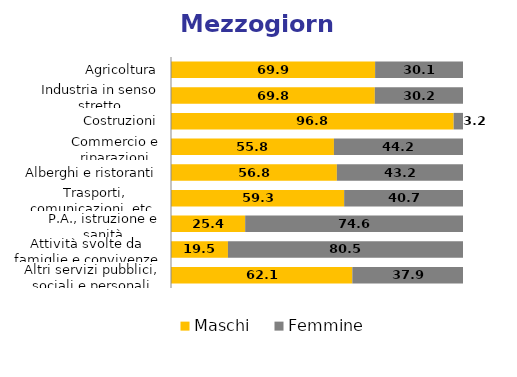
| Category | Maschi | Femmine |
|---|---|---|
| Agricoltura | 69.9 | 30.1 |
| Industria in senso stretto | 69.8 | 30.2 |
| Costruzioni | 96.8 | 3.2 |
| Commercio e riparazioni | 55.8 | 44.2 |
| Alberghi e ristoranti | 56.8 | 43.2 |
| Trasporti, comunicazioni, etc. | 59.3 | 40.7 |
| P.A., istruzione e sanità | 25.4 | 74.6 |
| Attività svolte da famiglie e convivenze | 19.5 | 80.5 |
| Altri servizi pubblici, sociali e personali | 62.1 | 37.9 |